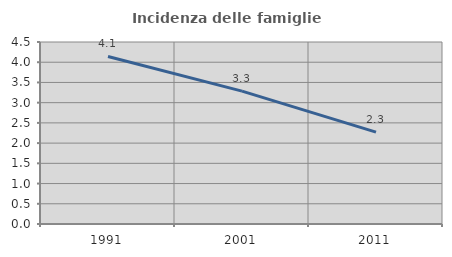
| Category | Incidenza delle famiglie numerose |
|---|---|
| 1991.0 | 4.142 |
| 2001.0 | 3.286 |
| 2011.0 | 2.273 |